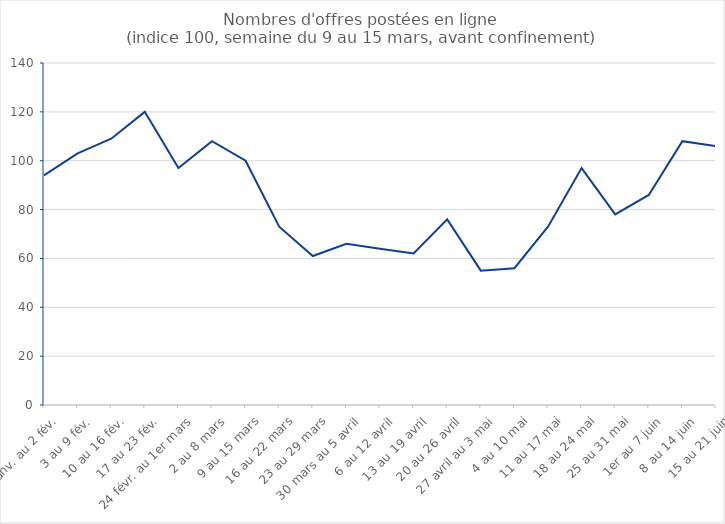
| Category | Series 0 |
|---|---|
| 27 janv. au 2 fév. | 94 |
| 3 au 9 fév. | 103 |
| 10 au 16 fév. | 109 |
| 17 au 23 fév. | 120 |
| 24 févr. au 1er mars | 97 |
| 2 au 8 mars | 108 |
| 9 au 15 mars | 100 |
| 16 au 22 mars | 73 |
| 23 au 29 mars | 61 |
| 30 mars au 5 avril | 66 |
| 6 au 12 avril | 64 |
| 13 au 19 avril | 62 |
| 20 au 26 avril | 76 |
| 27 avril au 3 mai | 55 |
| 4 au 10 mai | 56 |
| 11 au 17 mai | 73 |
| 18 au 24 mai | 97 |
| 25 au 31 mai | 78 |
| 1er au 7 juin | 86 |
| 8 au 14 juin | 108 |
| 15 au 21 juin | 106 |